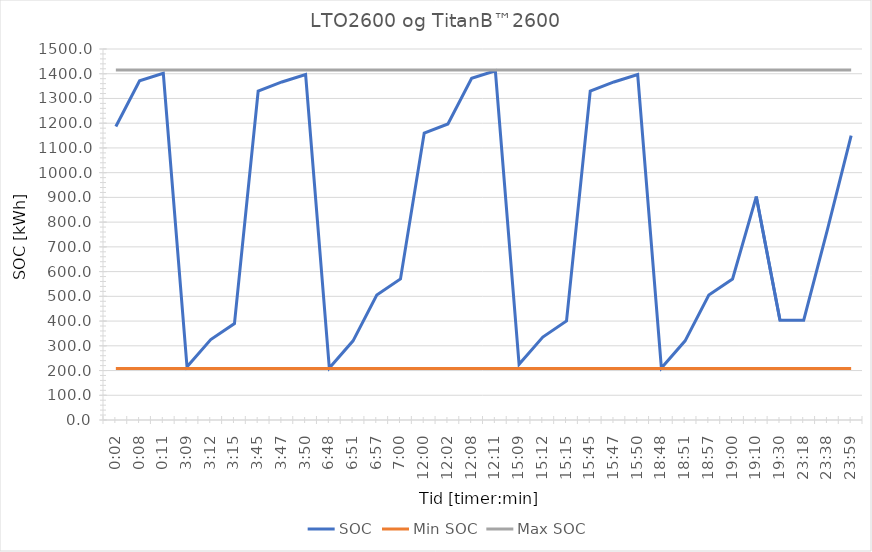
| Category | SOC | Min SOC | Max SOC |
|---|---|---|---|
| 0.001388888888888889 | 1186.667 | 208.333 | 1415 |
| 0.005555555555555556 | 1371.667 | 208.333 | 1415 |
| 0.007638888888888889 | 1401.667 | 208.333 | 1415 |
| 0.13125 | 215 | 208.333 | 1415 |
| 0.13333333333333333 | 325 | 208.333 | 1415 |
| 0.13541666666666666 | 390 | 208.333 | 1415 |
| 0.15625 | 1330.1 | 208.333 | 1415 |
| 0.15763888888888888 | 1366.767 | 208.333 | 1415 |
| 0.15972222222222224 | 1396.767 | 208.333 | 1415 |
| 0.2833333333333333 | 210.1 | 208.333 | 1415 |
| 0.28541666666666665 | 320.1 | 208.333 | 1415 |
| 0.28958333333333336 | 505.1 | 208.333 | 1415 |
| 0.2916666666666667 | 570.1 | 208.333 | 1415 |
| 0.5 | 1160.3 | 208.333 | 1415 |
| 0.5013888888888889 | 1196.967 | 208.333 | 1415 |
| 0.5055555555555555 | 1381.967 | 208.333 | 1415 |
| 0.5076388888888889 | 1411.967 | 208.333 | 1415 |
| 0.63125 | 225.3 | 208.333 | 1415 |
| 0.6333333333333333 | 335.3 | 208.333 | 1415 |
| 0.6354166666666666 | 400.3 | 208.333 | 1415 |
| 0.65625 | 1330.1 | 208.333 | 1415 |
| 0.6576388888888889 | 1366.767 | 208.333 | 1415 |
| 0.6597222222222222 | 1396.767 | 208.333 | 1415 |
| 0.7833333333333333 | 210.1 | 208.333 | 1415 |
| 0.7854166666666668 | 320.1 | 208.333 | 1415 |
| 0.7895833333333333 | 505.1 | 208.333 | 1415 |
| 0.7916666666666666 | 570.1 | 208.333 | 1415 |
| 0.7986111111111112 | 903.433 | 208.333 | 1415 |
| 0.8125 | 403.433 | 208.333 | 1415 |
| 0.9708333333333333 | 403.433 | 208.333 | 1415 |
| 0.9847222222222222 | 770.1 | 208.333 | 1415 |
| 0.9993055555555556 | 1150 | 208.333 | 1415 |